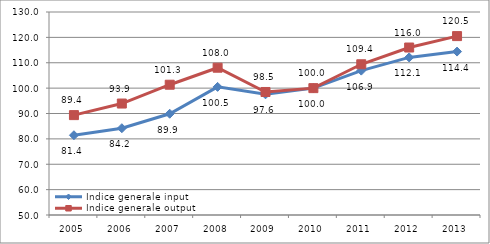
| Category | Indice generale input | Indice generale output |
|---|---|---|
| 2005.0 | 81.433 | 89.366 |
| 2006.0 | 84.202 | 93.923 |
| 2007.0 | 89.902 | 101.34 |
| 2008.0 | 100.489 | 108.043 |
| 2009.0 | 97.557 | 98.481 |
| 2010.0 | 100 | 100 |
| 2011.0 | 106.9 | 109.4 |
| 2012.0 | 112.1 | 116 |
| 2013.0 | 114.4 | 120.5 |